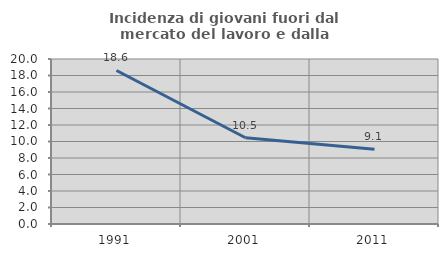
| Category | Incidenza di giovani fuori dal mercato del lavoro e dalla formazione  |
|---|---|
| 1991.0 | 18.61 |
| 2001.0 | 10.456 |
| 2011.0 | 9.064 |